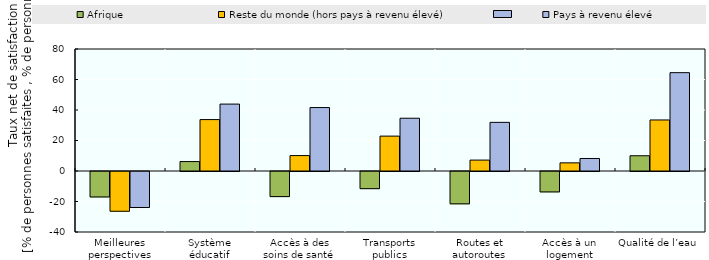
| Category | Afrique | Reste du monde (hors pays à revenu élevé) | Pays à revenu élevé |
|---|---|---|---|
| Meilleures perspectives d’emploi | -16.691 | -26.072 | -23.606 |
| Système éducatif | 6.189 | 33.718 | 43.874 |
| Accès à des soins de santé de qualité | -16.458 | 10.11 | 41.607 |
| Transports publics | -11.252 | 22.879 | 34.608 |
| Routes et autoroutes | -21.207 | 7.157 | 31.897 |
| Accès à un logement convenable à un prix abordable | -13.387 | 5.339 | 8.205 |
| Qualité de l’eau | 9.999 | 33.465 | 64.487 |